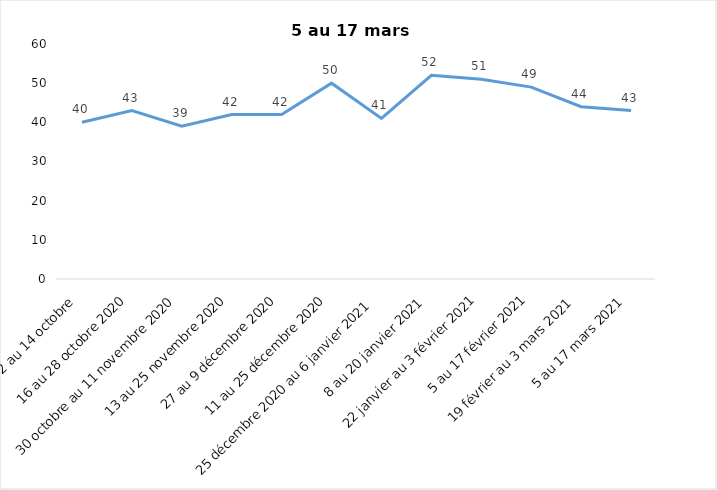
| Category | Toujours aux trois mesures |
|---|---|
| 2 au 14 octobre  | 40 |
| 16 au 28 octobre 2020 | 43 |
| 30 octobre au 11 novembre 2020 | 39 |
| 13 au 25 novembre 2020 | 42 |
| 27 au 9 décembre 2020 | 42 |
| 11 au 25 décembre 2020 | 50 |
| 25 décembre 2020 au 6 janvier 2021 | 41 |
| 8 au 20 janvier 2021 | 52 |
| 22 janvier au 3 février 2021 | 51 |
| 5 au 17 février 2021 | 49 |
| 19 février au 3 mars 2021 | 44 |
| 5 au 17 mars 2021 | 43 |